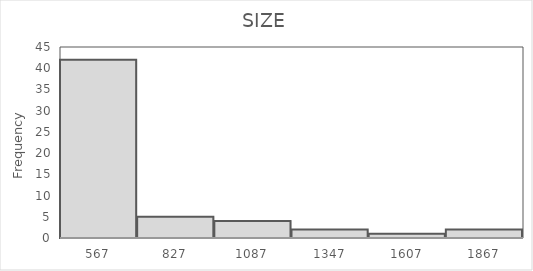
| Category | Frequency |
|---|---|
| 567.0 | 42 |
| 827.0 | 5 |
| 1087.0 | 4 |
| 1347.0 | 2 |
| 1607.0 | 1 |
| 1867.0 | 2 |